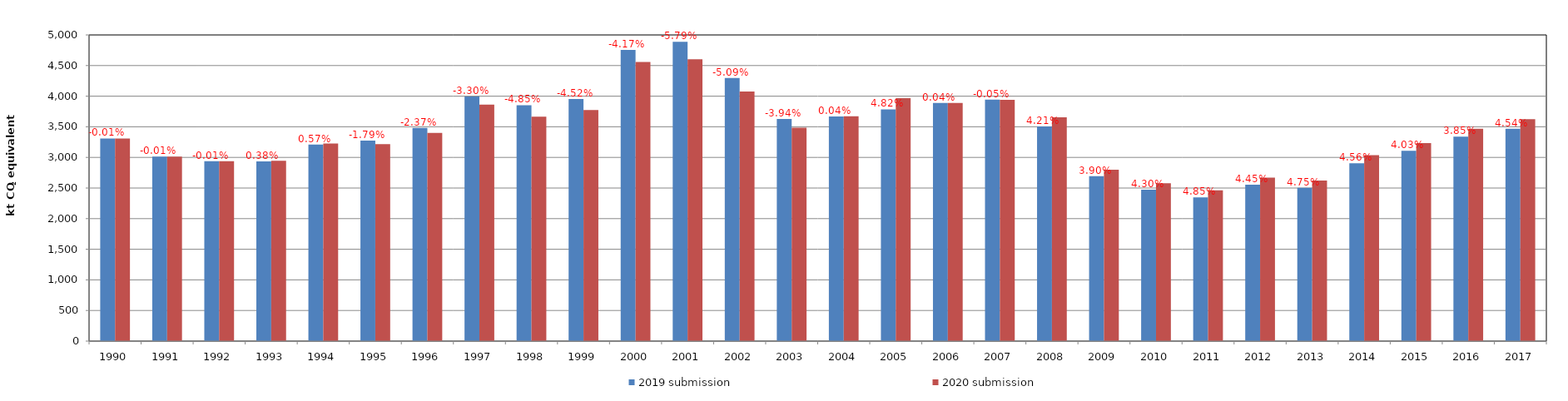
| Category | 2019 submission | 2020 submission |
|---|---|---|
| 1990.0 | 3309.413 | 3309.161 |
| 1991.0 | 3011.659 | 3011.414 |
| 1992.0 | 2938.26 | 2937.944 |
| 1993.0 | 2934.208 | 2945.426 |
| 1994.0 | 3208.454 | 3226.892 |
| 1995.0 | 3275.999 | 3217.336 |
| 1996.0 | 3482.005 | 3399.408 |
| 1997.0 | 3994.351 | 3862.633 |
| 1998.0 | 3853.002 | 3666.3 |
| 1999.0 | 3953.415 | 3774.582 |
| 2000.0 | 4756.892 | 4558.525 |
| 2001.0 | 4886.749 | 4603.749 |
| 2002.0 | 4295.528 | 4076.836 |
| 2003.0 | 3628.046 | 3484.991 |
| 2004.0 | 3669.782 | 3671.136 |
| 2005.0 | 3784.937 | 3967.375 |
| 2006.0 | 3888.738 | 3890.463 |
| 2007.0 | 3944.017 | 3941.849 |
| 2008.0 | 3506.726 | 3654.499 |
| 2009.0 | 2694.207 | 2799.275 |
| 2010.0 | 2471.487 | 2577.801 |
| 2011.0 | 2348.258 | 2462.207 |
| 2012.0 | 2554.845 | 2668.527 |
| 2013.0 | 2504.229 | 2623.165 |
| 2014.0 | 2904.817 | 3037.164 |
| 2015.0 | 3107.478 | 3232.716 |
| 2016.0 | 3338.543 | 3467.065 |
| 2017.0 | 3466.564 | 3623.784 |